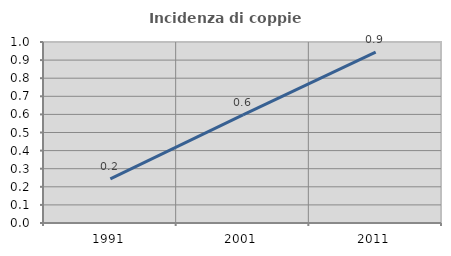
| Category | Incidenza di coppie miste |
|---|---|
| 1991.0 | 0.244 |
| 2001.0 | 0.597 |
| 2011.0 | 0.945 |